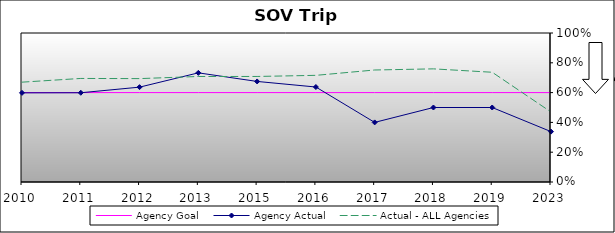
| Category | Agency Goal | Agency Actual | Actual - ALL Agencies |
|---|---|---|---|
| 2010.0 | 0.6 | 0.598 | 0.67 |
| 2011.0 | 0.6 | 0.599 | 0.695 |
| 2012.0 | 0.6 | 0.637 | 0.694 |
| 2013.0 | 0.6 | 0.732 | 0.708 |
| 2015.0 | 0.6 | 0.675 | 0.708 |
| 2016.0 | 0.6 | 0.637 | 0.716 |
| 2017.0 | 0.6 | 0.4 | 0.752 |
| 2018.0 | 0.6 | 0.5 | 0.759 |
| 2019.0 | 0.6 | 0.5 | 0.736 |
| 2023.0 | 0.6 | 0.338 | 0.47 |